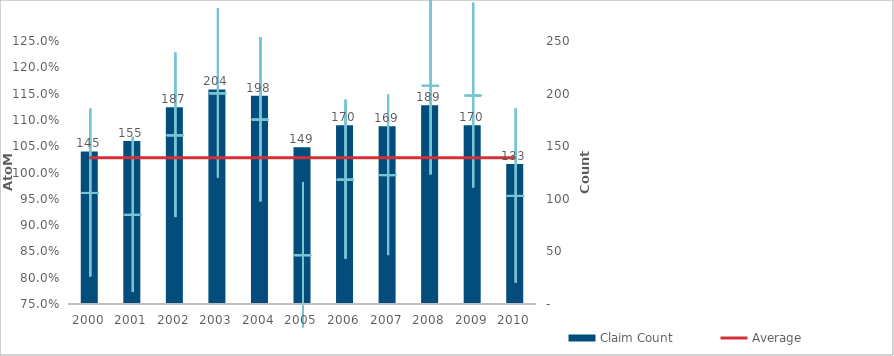
| Category | Claim Count |
|---|---|
| 0 | 145 |
| 1 | 155 |
| 2 | 187 |
| 3 | 204 |
| 4 | 198 |
| 5 | 149 |
| 6 | 170 |
| 7 | 169 |
| 8 | 189 |
| 9 | 170 |
| 10 | 133 |